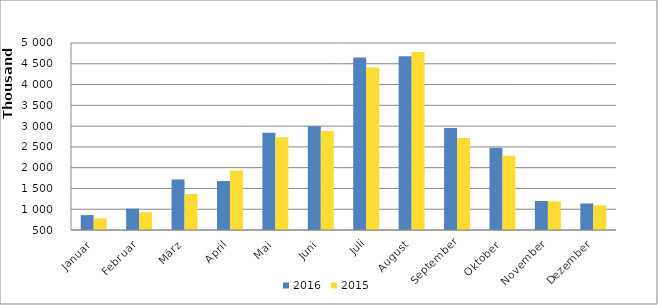
| Category | 2016 | 2015 |
|---|---|---|
| Januar | 858715 | 778546 |
| Februar | 1013616 | 926462 |
| März | 1715851 | 1365025 |
| April | 1677583 | 1929786 |
| Mai | 2842846 | 2729242 |
| Juni | 2996312 | 2880133 |
| Juli | 4648328 | 4408772 |
| August | 4681741 | 4784368 |
| September | 2955384 | 2714427 |
| Oktober | 2477889 | 2285457 |
| November | 1198475 | 1186883 |
| Dezember | 1137684 | 1093896 |